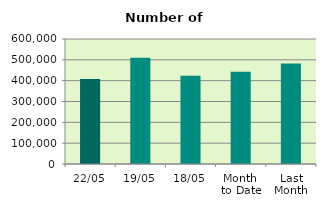
| Category | Series 0 |
|---|---|
| 22/05 | 407972 |
| 19/05 | 509664 |
| 18/05 | 423750 |
| Month 
to Date | 442424.667 |
| Last
Month | 481931.444 |